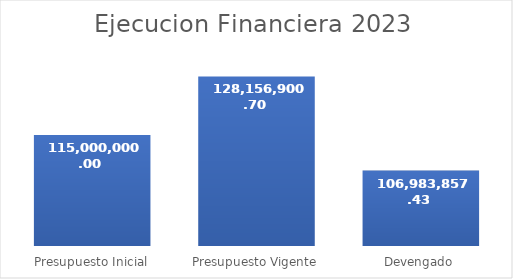
| Category | Series 0 |
|---|---|
| Presupuesto Inicial | 115000000 |
| Presupuesto Vigente | 128156900.7 |
| Devengado | 106983857.43 |